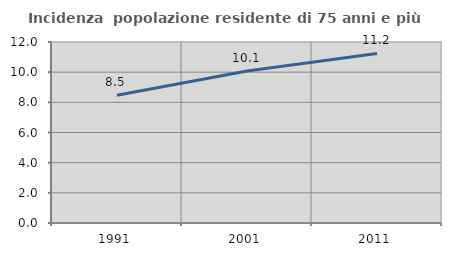
| Category | Incidenza  popolazione residente di 75 anni e più |
|---|---|
| 1991.0 | 8.464 |
| 2001.0 | 10.077 |
| 2011.0 | 11.239 |